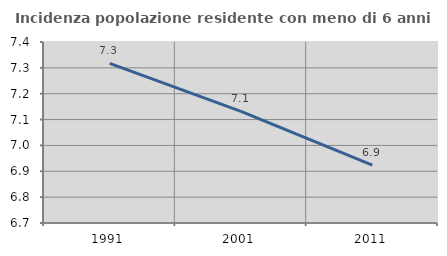
| Category | Incidenza popolazione residente con meno di 6 anni |
|---|---|
| 1991.0 | 7.317 |
| 2001.0 | 7.131 |
| 2011.0 | 6.924 |